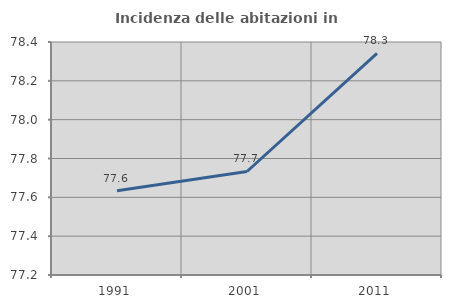
| Category | Incidenza delle abitazioni in proprietà  |
|---|---|
| 1991.0 | 77.633 |
| 2001.0 | 77.733 |
| 2011.0 | 78.342 |